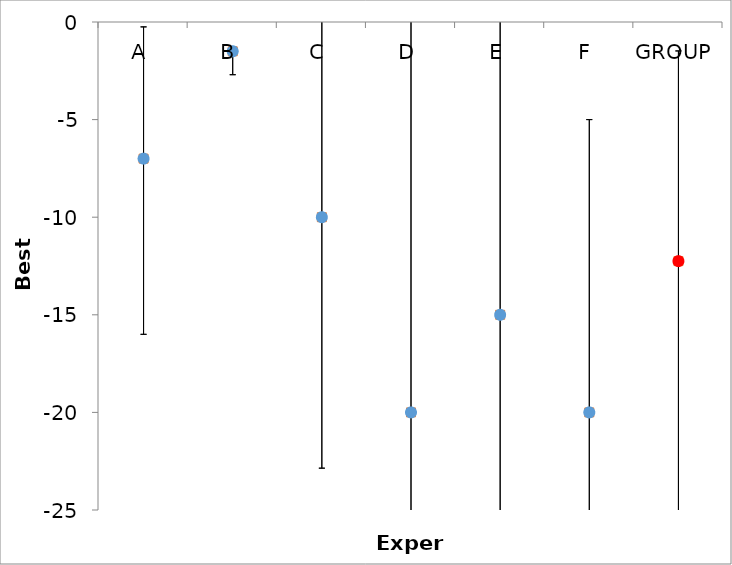
| Category | Series 1 | Series 0 |
|---|---|---|
| A | -7 | -7 |
| B | -1.5 | -1.5 |
| C | -10 | -10 |
| D | -20 | -20 |
| E | -15 | -15 |
| F | -20 | -20 |
| GROUP | -12.25 | -12.25 |